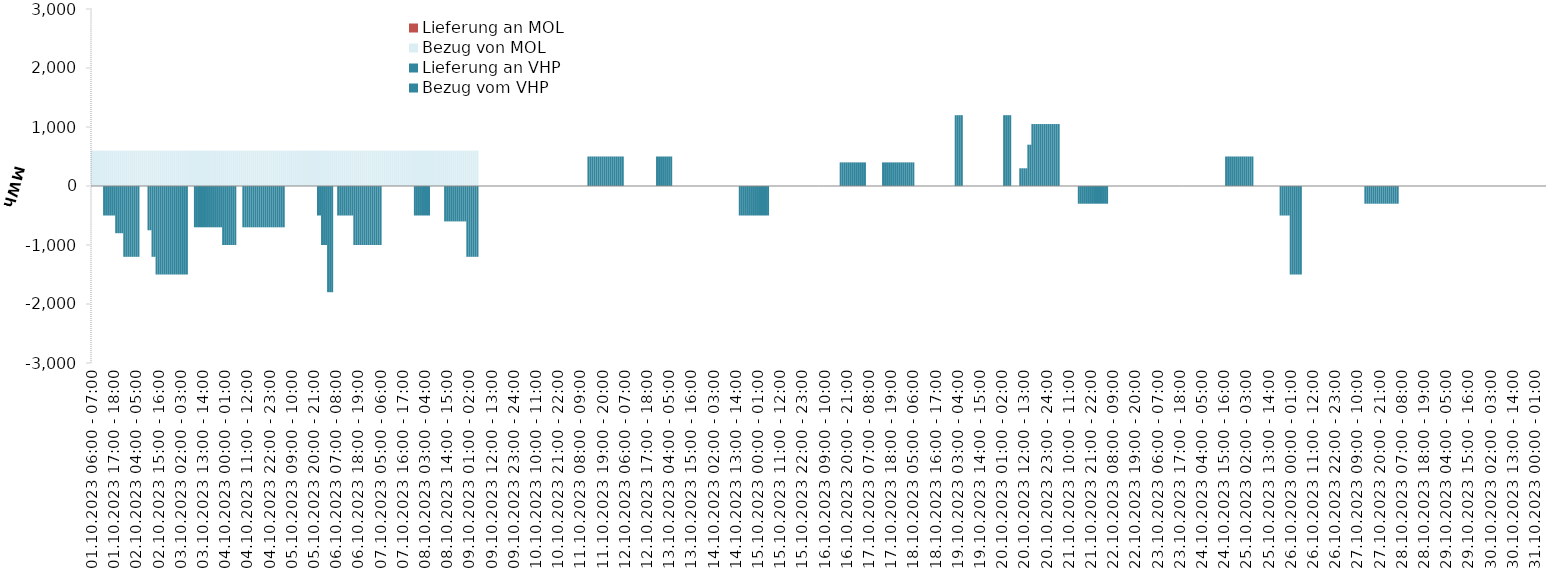
| Category | Bezug vom VHP | Lieferung an VHP | Bezug von MOL | Lieferung an MOL |
|---|---|---|---|---|
| 01.10.2023 06:00 - 07:00 | 0 | 0 | 600 | 0 |
| 01.10.2023 07:00 - 08:00 | 0 | 0 | 600 | 0 |
| 01.10.2023 08:00 - 09:00 | 0 | 0 | 600 | 0 |
| 01.10.2023 09:00 - 10:00 | 0 | 0 | 600 | 0 |
| 01.10.2023 10:00 - 11:00 | 0 | 0 | 600 | 0 |
| 01.10.2023 11:00 - 12:00 | 0 | 0 | 600 | 0 |
| 01.10.2023 12:00 - 13:00 | 0 | -500 | 600 | 0 |
| 01.10.2023 13:00 - 14:00 | 0 | -500 | 600 | 0 |
| 01.10.2023 14:00 - 15:00 | 0 | -500 | 600 | 0 |
| 01.10.2023 15:00 - 16:00 | 0 | -500 | 600 | 0 |
| 01.10.2023 16:00 - 17:00 | 0 | -500 | 600 | 0 |
| 01.10.2023 17:00 - 18:00 | 0 | -500 | 600 | 0 |
| 01.10.2023 18:00 - 19:00 | 0 | -800 | 600 | 0 |
| 01.10.2023 19:00 - 20:00 | 0 | -800 | 600 | 0 |
| 01.10.2023 20:00 - 21:00 | 0 | -800 | 600 | 0 |
| 01.10.2023 21:00 - 22:00 | 0 | -800 | 600 | 0 |
| 01.10.2023 22:00 - 23:00 | 0 | -1200 | 600 | 0 |
| 01.10.2023 23:00 - 24:00 | 0 | -1200 | 600 | 0 |
| 02.10.2023 00:00 - 01:00 | 0 | -1200 | 600 | 0 |
| 02.10.2023 01:00 - 02:00 | 0 | -1200 | 600 | 0 |
| 02.10.2023 02:00 - 03:00 | 0 | -1200 | 600 | 0 |
| 02.10.2023 03:00 - 04:00 | 0 | -1200 | 600 | 0 |
| 02.10.2023 04:00 - 05:00 | 0 | -1200 | 600 | 0 |
| 02.10.2023 05:00 - 06:00 | 0 | -1200 | 600 | 0 |
| 02.10.2023 06:00 - 07:00 | 0 | 0 | 600 | 0 |
| 02.10.2023 07:00 - 08:00 | 0 | 0 | 600 | 0 |
| 02.10.2023 08:00 - 09:00 | 0 | 0 | 600 | 0 |
| 02.10.2023 09:00 - 10:00 | 0 | 0 | 600 | 0 |
| 02.10.2023 10:00 - 11:00 | 0 | -750 | 600 | 0 |
| 02.10.2023 11:00 - 12:00 | 0 | -750 | 600 | 0 |
| 02.10.2023 12:00 - 13:00 | 0 | -1200 | 600 | 0 |
| 02.10.2023 13:00 - 14:00 | 0 | -1200 | 600 | 0 |
| 02.10.2023 14:00 - 15:00 | 0 | -1500 | 600 | 0 |
| 02.10.2023 15:00 - 16:00 | 0 | -1500 | 600 | 0 |
| 02.10.2023 16:00 - 17:00 | 0 | -1500 | 600 | 0 |
| 02.10.2023 17:00 - 18:00 | 0 | -1500 | 600 | 0 |
| 02.10.2023 18:00 - 19:00 | 0 | -1500 | 600 | 0 |
| 02.10.2023 19:00 - 20:00 | 0 | -1500 | 600 | 0 |
| 02.10.2023 20:00 - 21:00 | 0 | -1500 | 600 | 0 |
| 02.10.2023 21:00 - 22:00 | 0 | -1500 | 600 | 0 |
| 02.10.2023 22:00 - 23:00 | 0 | -1500 | 600 | 0 |
| 02.10.2023 23:00 - 24:00 | 0 | -1500 | 600 | 0 |
| 03.10.2023 00:00 - 01:00 | 0 | -1500 | 600 | 0 |
| 03.10.2023 01:00 - 02:00 | 0 | -1500 | 600 | 0 |
| 03.10.2023 02:00 - 03:00 | 0 | -1500 | 600 | 0 |
| 03.10.2023 03:00 - 04:00 | 0 | -1500 | 600 | 0 |
| 03.10.2023 04:00 - 05:00 | 0 | -1500 | 600 | 0 |
| 03.10.2023 05:00 - 06:00 | 0 | -1500 | 600 | 0 |
| 03.10.2023 06:00 - 07:00 | 0 | 0 | 600 | 0 |
| 03.10.2023 07:00 - 08:00 | 0 | 0 | 600 | 0 |
| 03.10.2023 08:00 - 09:00 | 0 | 0 | 600 | 0 |
| 03.10.2023 09:00 - 10:00 | 0 | -700 | 600 | 0 |
| 03.10.2023 10:00 - 11:00 | 0 | -700 | 600 | 0 |
| 03.10.2023 11:00 - 12:00 | 0 | -700 | 600 | 0 |
| 03.10.2023 12:00 - 13:00 | 0 | -700 | 600 | 0 |
| 03.10.2023 13:00 - 14:00 | 0 | -700 | 600 | 0 |
| 03.10.2023 14:00 - 15:00 | 0 | -700 | 600 | 0 |
| 03.10.2023 15:00 - 16:00 | 0 | -700 | 600 | 0 |
| 03.10.2023 16:00 - 17:00 | 0 | -700 | 600 | 0 |
| 03.10.2023 17:00 - 18:00 | 0 | -700 | 600 | 0 |
| 03.10.2023 18:00 - 19:00 | 0 | -700 | 600 | 0 |
| 03.10.2023 19:00 - 20:00 | 0 | -700 | 600 | 0 |
| 03.10.2023 20:00 - 21:00 | 0 | -700 | 600 | 0 |
| 03.10.2023 21:00 - 22:00 | 0 | -700 | 600 | 0 |
| 03.10.2023 22:00 - 23:00 | 0 | -700 | 600 | 0 |
| 03.10.2023 23:00 - 24:00 | 0 | -1000 | 600 | 0 |
| 04.10.2023 00:00 - 01:00 | 0 | -1000 | 600 | 0 |
| 04.10.2023 01:00 - 02:00 | 0 | -1000 | 600 | 0 |
| 04.10.2023 02:00 - 03:00 | 0 | -1000 | 600 | 0 |
| 04.10.2023 03:00 - 04:00 | 0 | -1000 | 600 | 0 |
| 04.10.2023 04:00 - 05:00 | 0 | -1000 | 600 | 0 |
| 04.10.2023 05:00 - 06:00 | 0 | -1000 | 600 | 0 |
| 04.10.2023 06:00 - 07:00 | 0 | 0 | 600 | 0 |
| 04.10.2023 07:00 - 08:00 | 0 | 0 | 600 | 0 |
| 04.10.2023 08:00 - 09:00 | 0 | 0 | 600 | 0 |
| 04.10.2023 09:00 - 10:00 | 0 | -700 | 600 | 0 |
| 04.10.2023 10:00 - 11:00 | 0 | -700 | 600 | 0 |
| 04.10.2023 11:00 - 12:00 | 0 | -700 | 600 | 0 |
| 04.10.2023 12:00 - 13:00 | 0 | -700 | 600 | 0 |
| 04.10.2023 13:00 - 14:00 | 0 | -700 | 600 | 0 |
| 04.10.2023 14:00 - 15:00 | 0 | -700 | 600 | 0 |
| 04.10.2023 15:00 - 16:00 | 0 | -700 | 600 | 0 |
| 04.10.2023 16:00 - 17:00 | 0 | -700 | 600 | 0 |
| 04.10.2023 17:00 - 18:00 | 0 | -700 | 600 | 0 |
| 04.10.2023 18:00 - 19:00 | 0 | -700 | 600 | 0 |
| 04.10.2023 19:00 - 20:00 | 0 | -700 | 600 | 0 |
| 04.10.2023 20:00 - 21:00 | 0 | -700 | 600 | 0 |
| 04.10.2023 21:00 - 22:00 | 0 | -700 | 600 | 0 |
| 04.10.2023 22:00 - 23:00 | 0 | -700 | 600 | 0 |
| 04.10.2023 23:00 - 24:00 | 0 | -700 | 600 | 0 |
| 05.10.2023 00:00 - 01:00 | 0 | -700 | 600 | 0 |
| 05.10.2023 01:00 - 02:00 | 0 | -700 | 600 | 0 |
| 05.10.2023 02:00 - 03:00 | 0 | -700 | 600 | 0 |
| 05.10.2023 03:00 - 04:00 | 0 | -700 | 600 | 0 |
| 05.10.2023 04:00 - 05:00 | 0 | -700 | 600 | 0 |
| 05.10.2023 05:00 - 06:00 | 0 | -700 | 600 | 0 |
| 05.10.2023 06:00 - 07:00 | 0 | 0 | 600 | 0 |
| 05.10.2023 07:00 - 08:00 | 0 | 0 | 600 | 0 |
| 05.10.2023 08:00 - 09:00 | 0 | 0 | 600 | 0 |
| 05.10.2023 09:00 - 10:00 | 0 | 0 | 600 | 0 |
| 05.10.2023 10:00 - 11:00 | 0 | 0 | 600 | 0 |
| 05.10.2023 11:00 - 12:00 | 0 | 0 | 600 | 0 |
| 05.10.2023 12:00 - 13:00 | 0 | 0 | 600 | 0 |
| 05.10.2023 13:00 - 14:00 | 0 | 0 | 600 | 0 |
| 05.10.2023 14:00 - 15:00 | 0 | 0 | 600 | 0 |
| 05.10.2023 15:00 - 16:00 | 0 | 0 | 600 | 0 |
| 05.10.2023 16:00 - 17:00 | 0 | 0 | 600 | 0 |
| 05.10.2023 17:00 - 18:00 | 0 | 0 | 600 | 0 |
| 05.10.2023 18:00 - 19:00 | 0 | 0 | 600 | 0 |
| 05.10.2023 19:00 - 20:00 | 0 | 0 | 600 | 0 |
| 05.10.2023 20:00 - 21:00 | 0 | 0 | 600 | 0 |
| 05.10.2023 21:00 - 22:00 | 0 | 0 | 600 | 0 |
| 05.10.2023 22:00 - 23:00 | 0 | -500 | 600 | 0 |
| 05.10.2023 23:00 - 24:00 | 0 | -500 | 600 | 0 |
| 06.10.2023 00:00 - 01:00 | 0 | -1000 | 600 | 0 |
| 06.10.2023 01:00 - 02:00 | 0 | -1000 | 600 | 0 |
| 06.10.2023 02:00 - 03:00 | 0 | -1000 | 600 | 0 |
| 06.10.2023 03:00 - 04:00 | 0 | -1800 | 600 | 0 |
| 06.10.2023 04:00 - 05:00 | 0 | -1800 | 600 | 0 |
| 06.10.2023 05:00 - 06:00 | 0 | -1800 | 600 | 0 |
| 06.10.2023 06:00 - 07:00 | 0 | 0 | 600 | 0 |
| 06.10.2023 07:00 - 08:00 | 0 | 0 | 600 | 0 |
| 06.10.2023 08:00 - 09:00 | 0 | -500 | 600 | 0 |
| 06.10.2023 09:00 - 10:00 | 0 | -500 | 600 | 0 |
| 06.10.2023 10:00 - 11:00 | 0 | -500 | 600 | 0 |
| 06.10.2023 11:00 - 12:00 | 0 | -500 | 600 | 0 |
| 06.10.2023 12:00 - 13:00 | 0 | -500 | 600 | 0 |
| 06.10.2023 13:00 - 14:00 | 0 | -500 | 600 | 0 |
| 06.10.2023 14:00 - 15:00 | 0 | -500 | 600 | 0 |
| 06.10.2023 15:00 - 16:00 | 0 | -500 | 600 | 0 |
| 06.10.2023 16:00 - 17:00 | 0 | -1000 | 600 | 0 |
| 06.10.2023 17:00 - 18:00 | 0 | -1000 | 600 | 0 |
| 06.10.2023 18:00 - 19:00 | 0 | -1000 | 600 | 0 |
| 06.10.2023 19:00 - 20:00 | 0 | -1000 | 600 | 0 |
| 06.10.2023 20:00 - 21:00 | 0 | -1000 | 600 | 0 |
| 06.10.2023 21:00 - 22:00 | 0 | -1000 | 600 | 0 |
| 06.10.2023 22:00 - 23:00 | 0 | -1000 | 600 | 0 |
| 06.10.2023 23:00 - 24:00 | 0 | -1000 | 600 | 0 |
| 07.10.2023 00:00 - 01:00 | 0 | -1000 | 600 | 0 |
| 07.10.2023 01:00 - 02:00 | 0 | -1000 | 600 | 0 |
| 07.10.2023 02:00 - 03:00 | 0 | -1000 | 600 | 0 |
| 07.10.2023 03:00 - 04:00 | 0 | -1000 | 600 | 0 |
| 07.10.2023 04:00 - 05:00 | 0 | -1000 | 600 | 0 |
| 07.10.2023 05:00 - 06:00 | 0 | -1000 | 600 | 0 |
| 07.10.2023 06:00 - 07:00 | 0 | 0 | 600 | 0 |
| 07.10.2023 07:00 - 08:00 | 0 | 0 | 600 | 0 |
| 07.10.2023 08:00 - 09:00 | 0 | 0 | 600 | 0 |
| 07.10.2023 09:00 - 10:00 | 0 | 0 | 600 | 0 |
| 07.10.2023 10:00 - 11:00 | 0 | 0 | 600 | 0 |
| 07.10.2023 11:00 - 12:00 | 0 | 0 | 600 | 0 |
| 07.10.2023 12:00 - 13:00 | 0 | 0 | 600 | 0 |
| 07.10.2023 13:00 - 14:00 | 0 | 0 | 600 | 0 |
| 07.10.2023 14:00 - 15:00 | 0 | 0 | 600 | 0 |
| 07.10.2023 15:00 - 16:00 | 0 | 0 | 600 | 0 |
| 07.10.2023 16:00 - 17:00 | 0 | 0 | 600 | 0 |
| 07.10.2023 17:00 - 18:00 | 0 | 0 | 600 | 0 |
| 07.10.2023 18:00 - 19:00 | 0 | 0 | 600 | 0 |
| 07.10.2023 19:00 - 20:00 | 0 | 0 | 600 | 0 |
| 07.10.2023 20:00 - 21:00 | 0 | 0 | 600 | 0 |
| 07.10.2023 21:00 - 22:00 | 0 | 0 | 600 | 0 |
| 07.10.2023 22:00 - 23:00 | 0 | -500 | 600 | 0 |
| 07.10.2023 23:00 - 24:00 | 0 | -500 | 600 | 0 |
| 08.10.2023 00:00 - 01:00 | 0 | -500 | 600 | 0 |
| 08.10.2023 01:00 - 02:00 | 0 | -500 | 600 | 0 |
| 08.10.2023 02:00 - 03:00 | 0 | -500 | 600 | 0 |
| 08.10.2023 03:00 - 04:00 | 0 | -500 | 600 | 0 |
| 08.10.2023 04:00 - 05:00 | 0 | -500 | 600 | 0 |
| 08.10.2023 05:00 - 06:00 | 0 | -500 | 600 | 0 |
| 08.10.2023 06:00 - 07:00 | 0 | 0 | 600 | 0 |
| 08.10.2023 07:00 - 08:00 | 0 | 0 | 600 | 0 |
| 08.10.2023 08:00 - 09:00 | 0 | 0 | 600 | 0 |
| 08.10.2023 09:00 - 10:00 | 0 | 0 | 600 | 0 |
| 08.10.2023 10:00 - 11:00 | 0 | 0 | 600 | 0 |
| 08.10.2023 11:00 - 12:00 | 0 | 0 | 600 | 0 |
| 08.10.2023 12:00 - 13:00 | 0 | 0 | 600 | 0 |
| 08.10.2023 13:00 - 14:00 | 0 | -600 | 600 | 0 |
| 08.10.2023 14:00 - 15:00 | 0 | -600 | 600 | 0 |
| 08.10.2023 15:00 - 16:00 | 0 | -600 | 600 | 0 |
| 08.10.2023 16:00 - 17:00 | 0 | -600 | 600 | 0 |
| 08.10.2023 17:00 - 18:00 | 0 | -600 | 600 | 0 |
| 08.10.2023 18:00 - 19:00 | 0 | -600 | 600 | 0 |
| 08.10.2023 19:00 - 20:00 | 0 | -600 | 600 | 0 |
| 08.10.2023 20:00 - 21:00 | 0 | -600 | 600 | 0 |
| 08.10.2023 21:00 - 22:00 | 0 | -600 | 600 | 0 |
| 08.10.2023 22:00 - 23:00 | 0 | -600 | 600 | 0 |
| 08.10.2023 23:00 - 24:00 | 0 | -600 | 600 | 0 |
| 09.10.2023 00:00 - 01:00 | 0 | -1200 | 600 | 0 |
| 09.10.2023 01:00 - 02:00 | 0 | -1200 | 600 | 0 |
| 09.10.2023 02:00 - 03:00 | 0 | -1200 | 600 | 0 |
| 09.10.2023 03:00 - 04:00 | 0 | -1200 | 600 | 0 |
| 09.10.2023 04:00 - 05:00 | 0 | -1200 | 600 | 0 |
| 09.10.2023 05:00 - 06:00 | 0 | -1200 | 600 | 0 |
| 09.10.2023 06:00 - 07:00 | 0 | 0 | 0 | 0 |
| 09.10.2023 07:00 - 08:00 | 0 | 0 | 0 | 0 |
| 09.10.2023 08:00 - 09:00 | 0 | 0 | 0 | 0 |
| 09.10.2023 09:00 - 10:00 | 0 | 0 | 0 | 0 |
| 09.10.2023 10:00 - 11:00 | 0 | 0 | 0 | 0 |
| 09.10.2023 11:00 - 12:00 | 0 | 0 | 0 | 0 |
| 09.10.2023 12:00 - 13:00 | 0 | 0 | 0 | 0 |
| 09.10.2023 13:00 - 14:00 | 0 | 0 | 0 | 0 |
| 09.10.2023 14:00 - 15:00 | 0 | 0 | 0 | 0 |
| 09.10.2023 15:00 - 16:00 | 0 | 0 | 0 | 0 |
| 09.10.2023 16:00 - 17:00 | 0 | 0 | 0 | 0 |
| 09.10.2023 17:00 - 18:00 | 0 | 0 | 0 | 0 |
| 09.10.2023 18:00 - 19:00 | 0 | 0 | 0 | 0 |
| 09.10.2023 19:00 - 20:00 | 0 | 0 | 0 | 0 |
| 09.10.2023 20:00 - 21:00 | 0 | 0 | 0 | 0 |
| 09.10.2023 21:00 - 22:00 | 0 | 0 | 0 | 0 |
| 09.10.2023 22:00 - 23:00 | 0 | 0 | 0 | 0 |
| 09.10.2023 23:00 - 24:00 | 0 | 0 | 0 | 0 |
| 10.10.2023 00:00 - 01:00 | 0 | 0 | 0 | 0 |
| 10.10.2023 01:00 - 02:00 | 0 | 0 | 0 | 0 |
| 10.10.2023 02:00 - 03:00 | 0 | 0 | 0 | 0 |
| 10.10.2023 03:00 - 04:00 | 0 | 0 | 0 | 0 |
| 10.10.2023 04:00 - 05:00 | 0 | 0 | 0 | 0 |
| 10.10.2023 05:00 - 06:00 | 0 | 0 | 0 | 0 |
| 10.10.2023 06:00 - 07:00 | 0 | 0 | 0 | 0 |
| 10.10.2023 07:00 - 08:00 | 0 | 0 | 0 | 0 |
| 10.10.2023 08:00 - 09:00 | 0 | 0 | 0 | 0 |
| 10.10.2023 09:00 - 10:00 | 0 | 0 | 0 | 0 |
| 10.10.2023 10:00 - 11:00 | 0 | 0 | 0 | 0 |
| 10.10.2023 11:00 - 12:00 | 0 | 0 | 0 | 0 |
| 10.10.2023 12:00 - 13:00 | 0 | 0 | 0 | 0 |
| 10.10.2023 13:00 - 14:00 | 0 | 0 | 0 | 0 |
| 10.10.2023 14:00 - 15:00 | 0 | 0 | 0 | 0 |
| 10.10.2023 15:00 - 16:00 | 0 | 0 | 0 | 0 |
| 10.10.2023 16:00 - 17:00 | 0 | 0 | 0 | 0 |
| 10.10.2023 17:00 - 18:00 | 0 | 0 | 0 | 0 |
| 10.10.2023 18:00 - 19:00 | 0 | 0 | 0 | 0 |
| 10.10.2023 19:00 - 20:00 | 0 | 0 | 0 | 0 |
| 10.10.2023 20:00 - 21:00 | 0 | 0 | 0 | 0 |
| 10.10.2023 21:00 - 22:00 | 0 | 0 | 0 | 0 |
| 10.10.2023 22:00 - 23:00 | 0 | 0 | 0 | 0 |
| 10.10.2023 23:00 - 24:00 | 0 | 0 | 0 | 0 |
| 11.10.2023 00:00 - 01:00 | 0 | 0 | 0 | 0 |
| 11.10.2023 01:00 - 02:00 | 0 | 0 | 0 | 0 |
| 11.10.2023 02:00 - 03:00 | 0 | 0 | 0 | 0 |
| 11.10.2023 03:00 - 04:00 | 0 | 0 | 0 | 0 |
| 11.10.2023 04:00 - 05:00 | 0 | 0 | 0 | 0 |
| 11.10.2023 05:00 - 06:00 | 0 | 0 | 0 | 0 |
| 11.10.2023 06:00 - 07:00 | 0 | 0 | 0 | 0 |
| 11.10.2023 07:00 - 08:00 | 0 | 0 | 0 | 0 |
| 11.10.2023 08:00 - 09:00 | 0 | 0 | 0 | 0 |
| 11.10.2023 09:00 - 10:00 | 0 | 0 | 0 | 0 |
| 11.10.2023 10:00 - 11:00 | 0 | 0 | 0 | 0 |
| 11.10.2023 11:00 - 12:00 | 0 | 0 | 0 | 0 |
| 11.10.2023 12:00 - 13:00 | 500 | 0 | 0 | 0 |
| 11.10.2023 13:00 - 14:00 | 500 | 0 | 0 | 0 |
| 11.10.2023 14:00 - 15:00 | 500 | 0 | 0 | 0 |
| 11.10.2023 15:00 - 16:00 | 500 | 0 | 0 | 0 |
| 11.10.2023 16:00 - 17:00 | 500 | 0 | 0 | 0 |
| 11.10.2023 17:00 - 18:00 | 500 | 0 | 0 | 0 |
| 11.10.2023 18:00 - 19:00 | 500 | 0 | 0 | 0 |
| 11.10.2023 19:00 - 20:00 | 500 | 0 | 0 | 0 |
| 11.10.2023 20:00 - 21:00 | 500 | 0 | 0 | 0 |
| 11.10.2023 21:00 - 22:00 | 500 | 0 | 0 | 0 |
| 11.10.2023 22:00 - 23:00 | 500 | 0 | 0 | 0 |
| 11.10.2023 23:00 - 24:00 | 500 | 0 | 0 | 0 |
| 12.10.2023 00:00 - 01:00 | 500 | 0 | 0 | 0 |
| 12.10.2023 01:00 - 02:00 | 500 | 0 | 0 | 0 |
| 12.10.2023 02:00 - 03:00 | 500 | 0 | 0 | 0 |
| 12.10.2023 03:00 - 04:00 | 500 | 0 | 0 | 0 |
| 12.10.2023 04:00 - 05:00 | 500 | 0 | 0 | 0 |
| 12.10.2023 05:00 - 06:00 | 500 | 0 | 0 | 0 |
| 12.10.2023 06:00 - 07:00 | 0 | 0 | 0 | 0 |
| 12.10.2023 07:00 - 08:00 | 0 | 0 | 0 | 0 |
| 12.10.2023 08:00 - 09:00 | 0 | 0 | 0 | 0 |
| 12.10.2023 09:00 - 10:00 | 0 | 0 | 0 | 0 |
| 12.10.2023 10:00 - 11:00 | 0 | 0 | 0 | 0 |
| 12.10.2023 11:00 - 12:00 | 0 | 0 | 0 | 0 |
| 12.10.2023 12:00 - 13:00 | 0 | 0 | 0 | 0 |
| 12.10.2023 13:00 - 14:00 | 0 | 0 | 0 | 0 |
| 12.10.2023 14:00 - 15:00 | 0 | 0 | 0 | 0 |
| 12.10.2023 15:00 - 16:00 | 0 | 0 | 0 | 0 |
| 12.10.2023 16:00 - 17:00 | 0 | 0 | 0 | 0 |
| 12.10.2023 17:00 - 18:00 | 0 | 0 | 0 | 0 |
| 12.10.2023 18:00 - 19:00 | 0 | 0 | 0 | 0 |
| 12.10.2023 19:00 - 20:00 | 0 | 0 | 0 | 0 |
| 12.10.2023 20:00 - 21:00 | 0 | 0 | 0 | 0 |
| 12.10.2023 21:00 - 22:00 | 0 | 0 | 0 | 0 |
| 12.10.2023 22:00 - 23:00 | 500 | 0 | 0 | 0 |
| 12.10.2023 23:00 - 24:00 | 500 | 0 | 0 | 0 |
| 13.10.2023 00:00 - 01:00 | 500 | 0 | 0 | 0 |
| 13.10.2023 01:00 - 02:00 | 500 | 0 | 0 | 0 |
| 13.10.2023 02:00 - 03:00 | 500 | 0 | 0 | 0 |
| 13.10.2023 03:00 - 04:00 | 500 | 0 | 0 | 0 |
| 13.10.2023 04:00 - 05:00 | 500 | 0 | 0 | 0 |
| 13.10.2023 05:00 - 06:00 | 500 | 0 | 0 | 0 |
| 13.10.2023 06:00 - 07:00 | 0 | 0 | 0 | 0 |
| 13.10.2023 07:00 - 08:00 | 0 | 0 | 0 | 0 |
| 13.10.2023 08:00 - 09:00 | 0 | 0 | 0 | 0 |
| 13.10.2023 09:00 - 10:00 | 0 | 0 | 0 | 0 |
| 13.10.2023 10:00 - 11:00 | 0 | 0 | 0 | 0 |
| 13.10.2023 11:00 - 12:00 | 0 | 0 | 0 | 0 |
| 13.10.2023 12:00 - 13:00 | 0 | 0 | 0 | 0 |
| 13.10.2023 13:00 - 14:00 | 0 | 0 | 0 | 0 |
| 13.10.2023 14:00 - 15:00 | 0 | 0 | 0 | 0 |
| 13.10.2023 15:00 - 16:00 | 0 | 0 | 0 | 0 |
| 13.10.2023 16:00 - 17:00 | 0 | 0 | 0 | 0 |
| 13.10.2023 17:00 - 18:00 | 0 | 0 | 0 | 0 |
| 13.10.2023 18:00 - 19:00 | 0 | 0 | 0 | 0 |
| 13.10.2023 19:00 - 20:00 | 0 | 0 | 0 | 0 |
| 13.10.2023 20:00 - 21:00 | 0 | 0 | 0 | 0 |
| 13.10.2023 21:00 - 22:00 | 0 | 0 | 0 | 0 |
| 13.10.2023 22:00 - 23:00 | 0 | 0 | 0 | 0 |
| 13.10.2023 23:00 - 24:00 | 0 | 0 | 0 | 0 |
| 14.10.2023 00:00 - 01:00 | 0 | 0 | 0 | 0 |
| 14.10.2023 01:00 - 02:00 | 0 | 0 | 0 | 0 |
| 14.10.2023 02:00 - 03:00 | 0 | 0 | 0 | 0 |
| 14.10.2023 03:00 - 04:00 | 0 | 0 | 0 | 0 |
| 14.10.2023 04:00 - 05:00 | 0 | 0 | 0 | 0 |
| 14.10.2023 05:00 - 06:00 | 0 | 0 | 0 | 0 |
| 14.10.2023 06:00 - 07:00 | 0 | 0 | 0 | 0 |
| 14.10.2023 07:00 - 08:00 | 0 | 0 | 0 | 0 |
| 14.10.2023 08:00 - 09:00 | 0 | 0 | 0 | 0 |
| 14.10.2023 09:00 - 10:00 | 0 | 0 | 0 | 0 |
| 14.10.2023 10:00 - 11:00 | 0 | 0 | 0 | 0 |
| 14.10.2023 11:00 - 12:00 | 0 | 0 | 0 | 0 |
| 14.10.2023 12:00 - 13:00 | 0 | 0 | 0 | 0 |
| 14.10.2023 13:00 - 14:00 | 0 | 0 | 0 | 0 |
| 14.10.2023 14:00 - 15:00 | 0 | 0 | 0 | 0 |
| 14.10.2023 15:00 - 16:00 | 0 | -500 | 0 | 0 |
| 14.10.2023 16:00 - 17:00 | 0 | -500 | 0 | 0 |
| 14.10.2023 17:00 - 18:00 | 0 | -500 | 0 | 0 |
| 14.10.2023 18:00 - 19:00 | 0 | -500 | 0 | 0 |
| 14.10.2023 19:00 - 20:00 | 0 | -500 | 0 | 0 |
| 14.10.2023 20:00 - 21:00 | 0 | -500 | 0 | 0 |
| 14.10.2023 21:00 - 22:00 | 0 | -500 | 0 | 0 |
| 14.10.2023 22:00 - 23:00 | 0 | -500 | 0 | 0 |
| 14.10.2023 23:00 - 24:00 | 0 | -500 | 0 | 0 |
| 15.10.2023 00:00 - 01:00 | 0 | -500 | 0 | 0 |
| 15.10.2023 01:00 - 02:00 | 0 | -500 | 0 | 0 |
| 15.10.2023 02:00 - 03:00 | 0 | -500 | 0 | 0 |
| 15.10.2023 03:00 - 04:00 | 0 | -500 | 0 | 0 |
| 15.10.2023 04:00 - 05:00 | 0 | -500 | 0 | 0 |
| 15.10.2023 05:00 - 06:00 | 0 | -500 | 0 | 0 |
| 15.10.2023 06:00 - 07:00 | 0 | 0 | 0 | 0 |
| 15.10.2023 07:00 - 08:00 | 0 | 0 | 0 | 0 |
| 15.10.2023 08:00 - 09:00 | 0 | 0 | 0 | 0 |
| 15.10.2023 09:00 - 10:00 | 0 | 0 | 0 | 0 |
| 15.10.2023 10:00 - 11:00 | 0 | 0 | 0 | 0 |
| 15.10.2023 11:00 - 12:00 | 0 | 0 | 0 | 0 |
| 15.10.2023 12:00 - 13:00 | 0 | 0 | 0 | 0 |
| 15.10.2023 13:00 - 14:00 | 0 | 0 | 0 | 0 |
| 15.10.2023 14:00 - 15:00 | 0 | 0 | 0 | 0 |
| 15.10.2023 15:00 - 16:00 | 0 | 0 | 0 | 0 |
| 15.10.2023 16:00 - 17:00 | 0 | 0 | 0 | 0 |
| 15.10.2023 17:00 - 18:00 | 0 | 0 | 0 | 0 |
| 15.10.2023 18:00 - 19:00 | 0 | 0 | 0 | 0 |
| 15.10.2023 19:00 - 20:00 | 0 | 0 | 0 | 0 |
| 15.10.2023 20:00 - 21:00 | 0 | 0 | 0 | 0 |
| 15.10.2023 21:00 - 22:00 | 0 | 0 | 0 | 0 |
| 15.10.2023 22:00 - 23:00 | 0 | 0 | 0 | 0 |
| 15.10.2023 23:00 - 24:00 | 0 | 0 | 0 | 0 |
| 16.10.2023 00:00 - 01:00 | 0 | 0 | 0 | 0 |
| 16.10.2023 01:00 - 02:00 | 0 | 0 | 0 | 0 |
| 16.10.2023 02:00 - 03:00 | 0 | 0 | 0 | 0 |
| 16.10.2023 03:00 - 04:00 | 0 | 0 | 0 | 0 |
| 16.10.2023 04:00 - 05:00 | 0 | 0 | 0 | 0 |
| 16.10.2023 05:00 - 06:00 | 0 | 0 | 0 | 0 |
| 16.10.2023 06:00 - 07:00 | 0 | 0 | 0 | 0 |
| 16.10.2023 07:00 - 08:00 | 0 | 0 | 0 | 0 |
| 16.10.2023 08:00 - 09:00 | 0 | 0 | 0 | 0 |
| 16.10.2023 09:00 - 10:00 | 0 | 0 | 0 | 0 |
| 16.10.2023 10:00 - 11:00 | 0 | 0 | 0 | 0 |
| 16.10.2023 11:00 - 12:00 | 0 | 0 | 0 | 0 |
| 16.10.2023 12:00 - 13:00 | 0 | 0 | 0 | 0 |
| 16.10.2023 13:00 - 14:00 | 0 | 0 | 0 | 0 |
| 16.10.2023 14:00 - 15:00 | 0 | 0 | 0 | 0 |
| 16.10.2023 15:00 - 16:00 | 0 | 0 | 0 | 0 |
| 16.10.2023 16:00 - 17:00 | 0 | 0 | 0 | 0 |
| 16.10.2023 17:00 - 18:00 | 400 | 0 | 0 | 0 |
| 16.10.2023 18:00 - 19:00 | 400 | 0 | 0 | 0 |
| 16.10.2023 19:00 - 20:00 | 400 | 0 | 0 | 0 |
| 16.10.2023 20:00 - 21:00 | 400 | 0 | 0 | 0 |
| 16.10.2023 21:00 - 22:00 | 400 | 0 | 0 | 0 |
| 16.10.2023 22:00 - 23:00 | 400 | 0 | 0 | 0 |
| 16.10.2023 23:00 - 24:00 | 400 | 0 | 0 | 0 |
| 17.10.2023 00:00 - 01:00 | 400 | 0 | 0 | 0 |
| 17.10.2023 01:00 - 02:00 | 400 | 0 | 0 | 0 |
| 17.10.2023 02:00 - 03:00 | 400 | 0 | 0 | 0 |
| 17.10.2023 03:00 - 04:00 | 400 | 0 | 0 | 0 |
| 17.10.2023 04:00 - 05:00 | 400 | 0 | 0 | 0 |
| 17.10.2023 05:00 - 06:00 | 400 | 0 | 0 | 0 |
| 17.10.2023 06:00 - 07:00 | 0 | 0 | 0 | 0 |
| 17.10.2023 07:00 - 08:00 | 0 | 0 | 0 | 0 |
| 17.10.2023 08:00 - 09:00 | 0 | 0 | 0 | 0 |
| 17.10.2023 09:00 - 10:00 | 0 | 0 | 0 | 0 |
| 17.10.2023 10:00 - 11:00 | 0 | 0 | 0 | 0 |
| 17.10.2023 11:00 - 12:00 | 0 | 0 | 0 | 0 |
| 17.10.2023 12:00 - 13:00 | 0 | 0 | 0 | 0 |
| 17.10.2023 13:00 - 14:00 | 0 | 0 | 0 | 0 |
| 17.10.2023 14:00 - 15:00 | 400 | 0 | 0 | 0 |
| 17.10.2023 15:00 - 16:00 | 400 | 0 | 0 | 0 |
| 17.10.2023 16:00 - 17:00 | 400 | 0 | 0 | 0 |
| 17.10.2023 17:00 - 18:00 | 400 | 0 | 0 | 0 |
| 17.10.2023 18:00 - 19:00 | 400 | 0 | 0 | 0 |
| 17.10.2023 19:00 - 20:00 | 400 | 0 | 0 | 0 |
| 17.10.2023 20:00 - 21:00 | 400 | 0 | 0 | 0 |
| 17.10.2023 21:00 - 22:00 | 400 | 0 | 0 | 0 |
| 17.10.2023 22:00 - 23:00 | 400 | 0 | 0 | 0 |
| 17.10.2023 23:00 - 24:00 | 400 | 0 | 0 | 0 |
| 18.10.2023 00:00 - 01:00 | 400 | 0 | 0 | 0 |
| 18.10.2023 01:00 - 02:00 | 400 | 0 | 0 | 0 |
| 18.10.2023 02:00 - 03:00 | 400 | 0 | 0 | 0 |
| 18.10.2023 03:00 - 04:00 | 400 | 0 | 0 | 0 |
| 18.10.2023 04:00 - 05:00 | 400 | 0 | 0 | 0 |
| 18.10.2023 05:00 - 06:00 | 400 | 0 | 0 | 0 |
| 18.10.2023 06:00 - 07:00 | 0 | 0 | 0 | 0 |
| 18.10.2023 07:00 - 08:00 | 0 | 0 | 0 | 0 |
| 18.10.2023 08:00 - 09:00 | 0 | 0 | 0 | 0 |
| 18.10.2023 09:00 - 10:00 | 0 | 0 | 0 | 0 |
| 18.10.2023 10:00 - 11:00 | 0 | 0 | 0 | 0 |
| 18.10.2023 11:00 - 12:00 | 0 | 0 | 0 | 0 |
| 18.10.2023 12:00 - 13:00 | 0 | 0 | 0 | 0 |
| 18.10.2023 13:00 - 14:00 | 0 | 0 | 0 | 0 |
| 18.10.2023 14:00 - 15:00 | 0 | 0 | 0 | 0 |
| 18.10.2023 15:00 - 16:00 | 0 | 0 | 0 | 0 |
| 18.10.2023 16:00 - 17:00 | 0 | 0 | 0 | 0 |
| 18.10.2023 17:00 - 18:00 | 0 | 0 | 0 | 0 |
| 18.10.2023 18:00 - 19:00 | 0 | 0 | 0 | 0 |
| 18.10.2023 19:00 - 20:00 | 0 | 0 | 0 | 0 |
| 18.10.2023 20:00 - 21:00 | 0 | 0 | 0 | 0 |
| 18.10.2023 21:00 - 22:00 | 0 | 0 | 0 | 0 |
| 18.10.2023 22:00 - 23:00 | 0 | 0 | 0 | 0 |
| 18.10.2023 23:00 - 24:00 | 0 | 0 | 0 | 0 |
| 19.10.2023 00:00 - 01:00 | 0 | 0 | 0 | 0 |
| 19.10.2023 01:00 - 02:00 | 0 | 0 | 0 | 0 |
| 19.10.2023 02:00 - 03:00 | 1200 | 0 | 0 | 0 |
| 19.10.2023 03:00 - 04:00 | 1200 | 0 | 0 | 0 |
| 19.10.2023 04:00 - 05:00 | 1200 | 0 | 0 | 0 |
| 19.10.2023 05:00 - 06:00 | 1200 | 0 | 0 | 0 |
| 19.10.2023 06:00 - 07:00 | 0 | 0 | 0 | 0 |
| 19.10.2023 07:00 - 08:00 | 0 | 0 | 0 | 0 |
| 19.10.2023 08:00 - 09:00 | 0 | 0 | 0 | 0 |
| 19.10.2023 09:00 - 10:00 | 0 | 0 | 0 | 0 |
| 19.10.2023 10:00 - 11:00 | 0 | 0 | 0 | 0 |
| 19.10.2023 11:00 - 12:00 | 0 | 0 | 0 | 0 |
| 19.10.2023 12:00 - 13:00 | 0 | 0 | 0 | 0 |
| 19.10.2023 13:00 - 14:00 | 0 | 0 | 0 | 0 |
| 19.10.2023 14:00 - 15:00 | 0 | 0 | 0 | 0 |
| 19.10.2023 15:00 - 16:00 | 0 | 0 | 0 | 0 |
| 19.10.2023 16:00 - 17:00 | 0 | 0 | 0 | 0 |
| 19.10.2023 17:00 - 18:00 | 0 | 0 | 0 | 0 |
| 19.10.2023 18:00 - 19:00 | 0 | 0 | 0 | 0 |
| 19.10.2023 19:00 - 20:00 | 0 | 0 | 0 | 0 |
| 19.10.2023 20:00 - 21:00 | 0 | 0 | 0 | 0 |
| 19.10.2023 21:00 - 22:00 | 0 | 0 | 0 | 0 |
| 19.10.2023 22:00 - 23:00 | 0 | 0 | 0 | 0 |
| 19.10.2023 23:00 - 24:00 | 0 | 0 | 0 | 0 |
| 20.10.2023 00:00 - 01:00 | 0 | 0 | 0 | 0 |
| 20.10.2023 01:00 - 02:00 | 0 | 0 | 0 | 0 |
| 20.10.2023 02:00 - 03:00 | 1200 | 0 | 0 | 0 |
| 20.10.2023 03:00 - 04:00 | 1200 | 0 | 0 | 0 |
| 20.10.2023 04:00 - 05:00 | 1200 | 0 | 0 | 0 |
| 20.10.2023 05:00 - 06:00 | 1200 | 0 | 0 | 0 |
| 20.10.2023 06:00 - 07:00 | 0 | 0 | 0 | 0 |
| 20.10.2023 07:00 - 08:00 | 0 | 0 | 0 | 0 |
| 20.10.2023 08:00 - 09:00 | 0 | 0 | 0 | 0 |
| 20.10.2023 09:00 - 10:00 | 0 | 0 | 0 | 0 |
| 20.10.2023 10:00 - 11:00 | 300 | 0 | 0 | 0 |
| 20.10.2023 11:00 - 12:00 | 300 | 0 | 0 | 0 |
| 20.10.2023 12:00 - 13:00 | 300 | 0 | 0 | 0 |
| 20.10.2023 13:00 - 14:00 | 300 | 0 | 0 | 0 |
| 20.10.2023 14:00 - 15:00 | 700 | 0 | 0 | 0 |
| 20.10.2023 15:00 - 16:00 | 700 | 0 | 0 | 0 |
| 20.10.2023 16:00 - 17:00 | 1050 | 0 | 0 | 0 |
| 20.10.2023 17:00 - 18:00 | 1050 | 0 | 0 | 0 |
| 20.10.2023 18:00 - 19:00 | 1050 | 0 | 0 | 0 |
| 20.10.2023 19:00 - 20:00 | 1050 | 0 | 0 | 0 |
| 20.10.2023 20:00 - 21:00 | 1050 | 0 | 0 | 0 |
| 20.10.2023 21:00 - 22:00 | 1050 | 0 | 0 | 0 |
| 20.10.2023 22:00 - 23:00 | 1050 | 0 | 0 | 0 |
| 20.10.2023 23:00 - 24:00 | 1050 | 0 | 0 | 0 |
| 21.10.2023 00:00 - 01:00 | 1050 | 0 | 0 | 0 |
| 21.10.2023 01:00 - 02:00 | 1050 | 0 | 0 | 0 |
| 21.10.2023 02:00 - 03:00 | 1050 | 0 | 0 | 0 |
| 21.10.2023 03:00 - 04:00 | 1050 | 0 | 0 | 0 |
| 21.10.2023 04:00 - 05:00 | 1050 | 0 | 0 | 0 |
| 21.10.2023 05:00 - 06:00 | 1050 | 0 | 0 | 0 |
| 21.10.2023 06:00 - 07:00 | 0 | 0 | 0 | 0 |
| 21.10.2023 07:00 - 08:00 | 0 | 0 | 0 | 0 |
| 21.10.2023 08:00 - 09:00 | 0 | 0 | 0 | 0 |
| 21.10.2023 09:00 - 10:00 | 0 | 0 | 0 | 0 |
| 21.10.2023 10:00 - 11:00 | 0 | 0 | 0 | 0 |
| 21.10.2023 11:00 - 12:00 | 0 | 0 | 0 | 0 |
| 21.10.2023 12:00 - 13:00 | 0 | 0 | 0 | 0 |
| 21.10.2023 13:00 - 14:00 | 0 | 0 | 0 | 0 |
| 21.10.2023 14:00 - 15:00 | 0 | 0 | 0 | 0 |
| 21.10.2023 15:00 - 16:00 | 0 | -300 | 0 | 0 |
| 21.10.2023 16:00 - 17:00 | 0 | -300 | 0 | 0 |
| 21.10.2023 17:00 - 18:00 | 0 | -300 | 0 | 0 |
| 21.10.2023 18:00 - 19:00 | 0 | -300 | 0 | 0 |
| 21.10.2023 19:00 - 20:00 | 0 | -300 | 0 | 0 |
| 21.10.2023 20:00 - 21:00 | 0 | -300 | 0 | 0 |
| 21.10.2023 21:00 - 22:00 | 0 | -300 | 0 | 0 |
| 21.10.2023 22:00 - 23:00 | 0 | -300 | 0 | 0 |
| 21.10.2023 23:00 - 24:00 | 0 | -300 | 0 | 0 |
| 22.10.2023 00:00 - 01:00 | 0 | -300 | 0 | 0 |
| 22.10.2023 01:00 - 02:00 | 0 | -300 | 0 | 0 |
| 22.10.2023 02:00 - 03:00 | 0 | -300 | 0 | 0 |
| 22.10.2023 03:00 - 04:00 | 0 | -300 | 0 | 0 |
| 22.10.2023 04:00 - 05:00 | 0 | -300 | 0 | 0 |
| 22.10.2023 05:00 - 06:00 | 0 | -300 | 0 | 0 |
| 22.10.2023 06:00 - 07:00 | 0 | 0 | 0 | 0 |
| 22.10.2023 07:00 - 08:00 | 0 | 0 | 0 | 0 |
| 22.10.2023 08:00 - 09:00 | 0 | 0 | 0 | 0 |
| 22.10.2023 09:00 - 10:00 | 0 | 0 | 0 | 0 |
| 22.10.2023 10:00 - 11:00 | 0 | 0 | 0 | 0 |
| 22.10.2023 11:00 - 12:00 | 0 | 0 | 0 | 0 |
| 22.10.2023 12:00 - 13:00 | 0 | 0 | 0 | 0 |
| 22.10.2023 13:00 - 14:00 | 0 | 0 | 0 | 0 |
| 22.10.2023 14:00 - 15:00 | 0 | 0 | 0 | 0 |
| 22.10.2023 15:00 - 16:00 | 0 | 0 | 0 | 0 |
| 22.10.2023 16:00 - 17:00 | 0 | 0 | 0 | 0 |
| 22.10.2023 17:00 - 18:00 | 0 | 0 | 0 | 0 |
| 22.10.2023 18:00 - 19:00 | 0 | 0 | 0 | 0 |
| 22.10.2023 19:00 - 20:00 | 0 | 0 | 0 | 0 |
| 22.10.2023 20:00 - 21:00 | 0 | 0 | 0 | 0 |
| 22.10.2023 21:00 - 22:00 | 0 | 0 | 0 | 0 |
| 22.10.2023 22:00 - 23:00 | 0 | 0 | 0 | 0 |
| 22.10.2023 23:00 - 24:00 | 0 | 0 | 0 | 0 |
| 23.10.2023 00:00 - 01:00 | 0 | 0 | 0 | 0 |
| 23.10.2023 01:00 - 02:00 | 0 | 0 | 0 | 0 |
| 23.10.2023 02:00 - 03:00 | 0 | 0 | 0 | 0 |
| 23.10.2023 03:00 - 04:00 | 0 | 0 | 0 | 0 |
| 23.10.2023 04:00 - 05:00 | 0 | 0 | 0 | 0 |
| 23.10.2023 05:00 - 06:00 | 0 | 0 | 0 | 0 |
| 23.10.2023 06:00 - 07:00 | 0 | 0 | 0 | 0 |
| 23.10.2023 07:00 - 08:00 | 0 | 0 | 0 | 0 |
| 23.10.2023 08:00 - 09:00 | 0 | 0 | 0 | 0 |
| 23.10.2023 09:00 - 10:00 | 0 | 0 | 0 | 0 |
| 23.10.2023 10:00 - 11:00 | 0 | 0 | 0 | 0 |
| 23.10.2023 11:00 - 12:00 | 0 | 0 | 0 | 0 |
| 23.10.2023 12:00 - 13:00 | 0 | 0 | 0 | 0 |
| 23.10.2023 13:00 - 14:00 | 0 | 0 | 0 | 0 |
| 23.10.2023 14:00 - 15:00 | 0 | 0 | 0 | 0 |
| 23.10.2023 15:00 - 16:00 | 0 | 0 | 0 | 0 |
| 23.10.2023 16:00 - 17:00 | 0 | 0 | 0 | 0 |
| 23.10.2023 17:00 - 18:00 | 0 | 0 | 0 | 0 |
| 23.10.2023 18:00 - 19:00 | 0 | 0 | 0 | 0 |
| 23.10.2023 19:00 - 20:00 | 0 | 0 | 0 | 0 |
| 23.10.2023 20:00 - 21:00 | 0 | 0 | 0 | 0 |
| 23.10.2023 21:00 - 22:00 | 0 | 0 | 0 | 0 |
| 23.10.2023 22:00 - 23:00 | 0 | 0 | 0 | 0 |
| 23.10.2023 23:00 - 24:00 | 0 | 0 | 0 | 0 |
| 24.10.2023 00:00 - 01:00 | 0 | 0 | 0 | 0 |
| 24.10.2023 01:00 - 02:00 | 0 | 0 | 0 | 0 |
| 24.10.2023 02:00 - 03:00 | 0 | 0 | 0 | 0 |
| 24.10.2023 03:00 - 04:00 | 0 | 0 | 0 | 0 |
| 24.10.2023 04:00 - 05:00 | 0 | 0 | 0 | 0 |
| 24.10.2023 05:00 - 06:00 | 0 | 0 | 0 | 0 |
| 24.10.2023 06:00 - 07:00 | 0 | 0 | 0 | 0 |
| 24.10.2023 07:00 - 08:00 | 0 | 0 | 0 | 0 |
| 24.10.2023 08:00 - 09:00 | 0 | 0 | 0 | 0 |
| 24.10.2023 09:00 - 10:00 | 0 | 0 | 0 | 0 |
| 24.10.2023 10:00 - 11:00 | 0 | 0 | 0 | 0 |
| 24.10.2023 11:00 - 12:00 | 0 | 0 | 0 | 0 |
| 24.10.2023 12:00 - 13:00 | 0 | 0 | 0 | 0 |
| 24.10.2023 13:00 - 14:00 | 0 | 0 | 0 | 0 |
| 24.10.2023 14:00 - 15:00 | 0 | 0 | 0 | 0 |
| 24.10.2023 15:00 - 16:00 | 0 | 0 | 0 | 0 |
| 24.10.2023 16:00 - 17:00 | 500 | 0 | 0 | 0 |
| 24.10.2023 17:00 - 18:00 | 500 | 0 | 0 | 0 |
| 24.10.2023 18:00 - 19:00 | 500 | 0 | 0 | 0 |
| 24.10.2023 19:00 - 20:00 | 500 | 0 | 0 | 0 |
| 24.10.2023 20:00 - 21:00 | 500 | 0 | 0 | 0 |
| 24.10.2023 21:00 - 22:00 | 500 | 0 | 0 | 0 |
| 24.10.2023 22:00 - 23:00 | 500 | 0 | 0 | 0 |
| 24.10.2023 23:00 - 24:00 | 500 | 0 | 0 | 0 |
| 25.10.2023 00:00 - 01:00 | 500 | 0 | 0 | 0 |
| 25.10.2023 01:00 - 02:00 | 500 | 0 | 0 | 0 |
| 25.10.2023 02:00 - 03:00 | 500 | 0 | 0 | 0 |
| 25.10.2023 03:00 - 04:00 | 500 | 0 | 0 | 0 |
| 25.10.2023 04:00 - 05:00 | 500 | 0 | 0 | 0 |
| 25.10.2023 05:00 - 06:00 | 500 | 0 | 0 | 0 |
| 25.10.2023 06:00 - 07:00 | 0 | 0 | 0 | 0 |
| 25.10.2023 07:00 - 08:00 | 0 | 0 | 0 | 0 |
| 25.10.2023 08:00 - 09:00 | 0 | 0 | 0 | 0 |
| 25.10.2023 09:00 - 10:00 | 0 | 0 | 0 | 0 |
| 25.10.2023 10:00 - 11:00 | 0 | 0 | 0 | 0 |
| 25.10.2023 11:00 - 12:00 | 0 | 0 | 0 | 0 |
| 25.10.2023 12:00 - 13:00 | 0 | 0 | 0 | 0 |
| 25.10.2023 13:00 - 14:00 | 0 | 0 | 0 | 0 |
| 25.10.2023 14:00 - 15:00 | 0 | 0 | 0 | 0 |
| 25.10.2023 15:00 - 16:00 | 0 | 0 | 0 | 0 |
| 25.10.2023 16:00 - 17:00 | 0 | 0 | 0 | 0 |
| 25.10.2023 17:00 - 18:00 | 0 | 0 | 0 | 0 |
| 25.10.2023 18:00 - 19:00 | 0 | 0 | 0 | 0 |
| 25.10.2023 19:00 - 20:00 | 0 | -500 | 0 | 0 |
| 25.10.2023 20:00 - 21:00 | 0 | -500 | 0 | 0 |
| 25.10.2023 21:00 - 22:00 | 0 | -500 | 0 | 0 |
| 25.10.2023 22:00 - 23:00 | 0 | -500 | 0 | 0 |
| 25.10.2023 23:00 - 24:00 | 0 | -500 | 0 | 0 |
| 26.10.2023 00:00 - 01:00 | 0 | -1500 | 0 | 0 |
| 26.10.2023 01:00 - 02:00 | 0 | -1500 | 0 | 0 |
| 26.10.2023 02:00 - 03:00 | 0 | -1500 | 0 | 0 |
| 26.10.2023 03:00 - 04:00 | 0 | -1500 | 0 | 0 |
| 26.10.2023 04:00 - 05:00 | 0 | -1500 | 0 | 0 |
| 26.10.2023 05:00 - 06:00 | 0 | -1500 | 0 | 0 |
| 26.10.2023 06:00 - 07:00 | 0 | 0 | 0 | 0 |
| 26.10.2023 07:00 - 08:00 | 0 | 0 | 0 | 0 |
| 26.10.2023 08:00 - 09:00 | 0 | 0 | 0 | 0 |
| 26.10.2023 09:00 - 10:00 | 0 | 0 | 0 | 0 |
| 26.10.2023 10:00 - 11:00 | 0 | 0 | 0 | 0 |
| 26.10.2023 11:00 - 12:00 | 0 | 0 | 0 | 0 |
| 26.10.2023 12:00 - 13:00 | 0 | 0 | 0 | 0 |
| 26.10.2023 13:00 - 14:00 | 0 | 0 | 0 | 0 |
| 26.10.2023 14:00 - 15:00 | 0 | 0 | 0 | 0 |
| 26.10.2023 15:00 - 16:00 | 0 | 0 | 0 | 0 |
| 26.10.2023 16:00 - 17:00 | 0 | 0 | 0 | 0 |
| 26.10.2023 17:00 - 18:00 | 0 | 0 | 0 | 0 |
| 26.10.2023 18:00 - 19:00 | 0 | 0 | 0 | 0 |
| 26.10.2023 19:00 - 20:00 | 0 | 0 | 0 | 0 |
| 26.10.2023 20:00 - 21:00 | 0 | 0 | 0 | 0 |
| 26.10.2023 21:00 - 22:00 | 0 | 0 | 0 | 0 |
| 26.10.2023 22:00 - 23:00 | 0 | 0 | 0 | 0 |
| 26.10.2023 23:00 - 24:00 | 0 | 0 | 0 | 0 |
| 27.10.2023 00:00 - 01:00 | 0 | 0 | 0 | 0 |
| 27.10.2023 01:00 - 02:00 | 0 | 0 | 0 | 0 |
| 27.10.2023 02:00 - 03:00 | 0 | 0 | 0 | 0 |
| 27.10.2023 03:00 - 04:00 | 0 | 0 | 0 | 0 |
| 27.10.2023 04:00 - 05:00 | 0 | 0 | 0 | 0 |
| 27.10.2023 05:00 - 06:00 | 0 | 0 | 0 | 0 |
| 27.10.2023 06:00 - 07:00 | 0 | 0 | 0 | 0 |
| 27.10.2023 07:00 - 08:00 | 0 | 0 | 0 | 0 |
| 27.10.2023 08:00 - 09:00 | 0 | 0 | 0 | 0 |
| 27.10.2023 09:00 - 10:00 | 0 | 0 | 0 | 0 |
| 27.10.2023 10:00 - 11:00 | 0 | 0 | 0 | 0 |
| 27.10.2023 11:00 - 12:00 | 0 | 0 | 0 | 0 |
| 27.10.2023 12:00 - 13:00 | 0 | 0 | 0 | 0 |
| 27.10.2023 13:00 - 14:00 | 0 | -300 | 0 | 0 |
| 27.10.2023 14:00 - 15:00 | 0 | -300 | 0 | 0 |
| 27.10.2023 15:00 - 16:00 | 0 | -300 | 0 | 0 |
| 27.10.2023 16:00 - 17:00 | 0 | -300 | 0 | 0 |
| 27.10.2023 17:00 - 18:00 | 0 | -300 | 0 | 0 |
| 27.10.2023 18:00 - 19:00 | 0 | -300 | 0 | 0 |
| 27.10.2023 19:00 - 20:00 | 0 | -300 | 0 | 0 |
| 27.10.2023 20:00 - 21:00 | 0 | -300 | 0 | 0 |
| 27.10.2023 21:00 - 22:00 | 0 | -300 | 0 | 0 |
| 27.10.2023 22:00 - 23:00 | 0 | -300 | 0 | 0 |
| 27.10.2023 23:00 - 24:00 | 0 | -300 | 0 | 0 |
| 28.10.2023 00:00 - 01:00 | 0 | -300 | 0 | 0 |
| 28.10.2023 01:00 - 02:00 | 0 | -300 | 0 | 0 |
| 28.10.2023 02:00 - 03:00 | 0 | -300 | 0 | 0 |
| 28.10.2023 03:00 - 04:00 | 0 | -300 | 0 | 0 |
| 28.10.2023 04:00 - 05:00 | 0 | -300 | 0 | 0 |
| 28.10.2023 05:00 - 06:00 | 0 | -300 | 0 | 0 |
| 28.10.2023 06:00 - 07:00 | 0 | 0 | 0 | 0 |
| 28.10.2023 07:00 - 08:00 | 0 | 0 | 0 | 0 |
| 28.10.2023 08:00 - 09:00 | 0 | 0 | 0 | 0 |
| 28.10.2023 09:00 - 10:00 | 0 | 0 | 0 | 0 |
| 28.10.2023 10:00 - 11:00 | 0 | 0 | 0 | 0 |
| 28.10.2023 11:00 - 12:00 | 0 | 0 | 0 | 0 |
| 28.10.2023 12:00 - 13:00 | 0 | 0 | 0 | 0 |
| 28.10.2023 13:00 - 14:00 | 0 | 0 | 0 | 0 |
| 28.10.2023 14:00 - 15:00 | 0 | 0 | 0 | 0 |
| 28.10.2023 15:00 - 16:00 | 0 | 0 | 0 | 0 |
| 28.10.2023 16:00 - 17:00 | 0 | 0 | 0 | 0 |
| 28.10.2023 17:00 - 18:00 | 0 | 0 | 0 | 0 |
| 28.10.2023 18:00 - 19:00 | 0 | 0 | 0 | 0 |
| 28.10.2023 19:00 - 20:00 | 0 | 0 | 0 | 0 |
| 28.10.2023 20:00 - 21:00 | 0 | 0 | 0 | 0 |
| 28.10.2023 21:00 - 22:00 | 0 | 0 | 0 | 0 |
| 28.10.2023 22:00 - 23:00 | 0 | 0 | 0 | 0 |
| 28.10.2023 23:00 - 24:00 | 0 | 0 | 0 | 0 |
| 29.10.2023 00:00 - 01:00 | 0 | 0 | 0 | 0 |
| 29.10.2023 01:00 - 02:00 | 0 | 0 | 0 | 0 |
| 29.10.2023 02:00 - 02:00 | 0 | 0 | 0 | 0 |
| 29.10.2023 02:00 - 03:00 | 0 | 0 | 0 | 0 |
| 29.10.2023 03:00 - 04:00 | 0 | 0 | 0 | 0 |
| 29.10.2023 04:00 - 05:00 | 0 | 0 | 0 | 0 |
| 29.10.2023 05:00 - 06:00 | 0 | 0 | 0 | 0 |
| 29.10.2023 06:00 - 07:00 | 0 | 0 | 0 | 0 |
| 29.10.2023 07:00 - 08:00 | 0 | 0 | 0 | 0 |
| 29.10.2023 08:00 - 09:00 | 0 | 0 | 0 | 0 |
| 29.10.2023 09:00 - 10:00 | 0 | 0 | 0 | 0 |
| 29.10.2023 10:00 - 11:00 | 0 | 0 | 0 | 0 |
| 29.10.2023 11:00 - 12:00 | 0 | 0 | 0 | 0 |
| 29.10.2023 12:00 - 13:00 | 0 | 0 | 0 | 0 |
| 29.10.2023 13:00 - 14:00 | 0 | 0 | 0 | 0 |
| 29.10.2023 14:00 - 15:00 | 0 | 0 | 0 | 0 |
| 29.10.2023 15:00 - 16:00 | 0 | 0 | 0 | 0 |
| 29.10.2023 16:00 - 17:00 | 0 | 0 | 0 | 0 |
| 29.10.2023 17:00 - 18:00 | 0 | 0 | 0 | 0 |
| 29.10.2023 18:00 - 19:00 | 0 | 0 | 0 | 0 |
| 29.10.2023 19:00 - 20:00 | 0 | 0 | 0 | 0 |
| 29.10.2023 20:00 - 21:00 | 0 | 0 | 0 | 0 |
| 29.10.2023 21:00 - 22:00 | 0 | 0 | 0 | 0 |
| 29.10.2023 22:00 - 23:00 | 0 | 0 | 0 | 0 |
| 29.10.2023 23:00 - 24:00 | 0 | 0 | 0 | 0 |
| 30.10.2023 00:00 - 01:00 | 0 | 0 | 0 | 0 |
| 30.10.2023 01:00 - 02:00 | 0 | 0 | 0 | 0 |
| 30.10.2023 02:00 - 03:00 | 0 | 0 | 0 | 0 |
| 30.10.2023 03:00 - 04:00 | 0 | 0 | 0 | 0 |
| 30.10.2023 04:00 - 05:00 | 0 | 0 | 0 | 0 |
| 30.10.2023 05:00 - 06:00 | 0 | 0 | 0 | 0 |
| 30.10.2023 06:00 - 07:00 | 0 | 0 | 0 | 0 |
| 30.10.2023 07:00 - 08:00 | 0 | 0 | 0 | 0 |
| 30.10.2023 08:00 - 09:00 | 0 | 0 | 0 | 0 |
| 30.10.2023 09:00 - 10:00 | 0 | 0 | 0 | 0 |
| 30.10.2023 10:00 - 11:00 | 0 | 0 | 0 | 0 |
| 30.10.2023 11:00 - 12:00 | 0 | 0 | 0 | 0 |
| 30.10.2023 12:00 - 13:00 | 0 | 0 | 0 | 0 |
| 30.10.2023 13:00 - 14:00 | 0 | 0 | 0 | 0 |
| 30.10.2023 14:00 - 15:00 | 0 | 0 | 0 | 0 |
| 30.10.2023 15:00 - 16:00 | 0 | 0 | 0 | 0 |
| 30.10.2023 16:00 - 17:00 | 0 | 0 | 0 | 0 |
| 30.10.2023 17:00 - 18:00 | 0 | 0 | 0 | 0 |
| 30.10.2023 18:00 - 19:00 | 0 | 0 | 0 | 0 |
| 30.10.2023 19:00 - 20:00 | 0 | 0 | 0 | 0 |
| 30.10.2023 20:00 - 21:00 | 0 | 0 | 0 | 0 |
| 30.10.2023 21:00 - 22:00 | 0 | 0 | 0 | 0 |
| 30.10.2023 22:00 - 23:00 | 0 | 0 | 0 | 0 |
| 30.10.2023 23:00 - 24:00 | 0 | 0 | 0 | 0 |
| 31.10.2023 00:00 - 01:00 | 0 | 0 | 0 | 0 |
| 31.10.2023 01:00 - 02:00 | 0 | 0 | 0 | 0 |
| 31.10.2023 02:00 - 03:00 | 0 | 0 | 0 | 0 |
| 31.10.2023 03:00 - 04:00 | 0 | 0 | 0 | 0 |
| 31.10.2023 04:00 - 05:00 | 0 | 0 | 0 | 0 |
| 31.10.2023 05:00 - 06:00 | 0 | 0 | 0 | 0 |